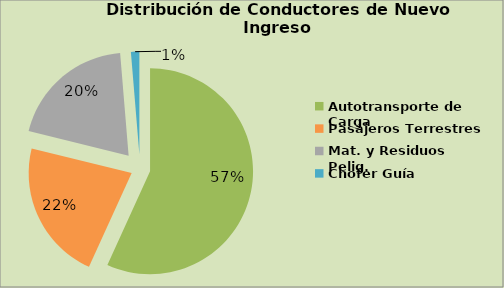
| Category | Series 0 |
|---|---|
| Autotransporte de Carga | 56.801 |
| Pasajeros Terrestres | 22.048 |
| Mat. y Residuos Pelig. | 19.832 |
| Chofer Guía | 1.32 |